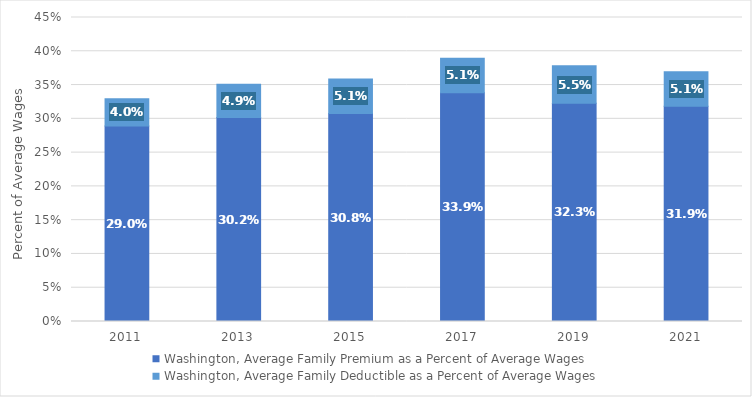
| Category | Washington, Average Family Premium as a Percent of Average Wages | Washington, Average Family Deductible as a Percent of Average Wages |
|---|---|---|
| 2011.0 | 0.29 | 0.04 |
| 2013.0 | 0.302 | 0.049 |
| 2015.0 | 0.308 | 0.051 |
| 2017.0 | 0.339 | 0.051 |
| 2019.0 | 0.323 | 0.055 |
| 2021.0 | 0.319 | 0.051 |